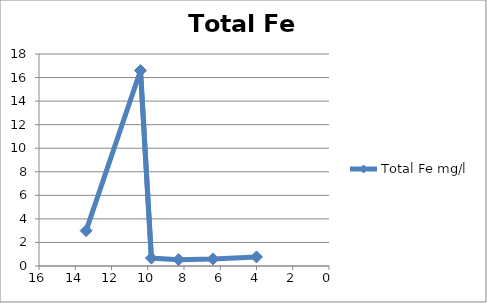
| Category | Total Fe mg/l |
|---|---|
| 13.4 | 3 |
| 10.4 | 16.6 |
| 9.8 | 0.67 |
| 8.3 | 0.54 |
| 6.4 | 0.6 |
| 4.0 | 0.77 |